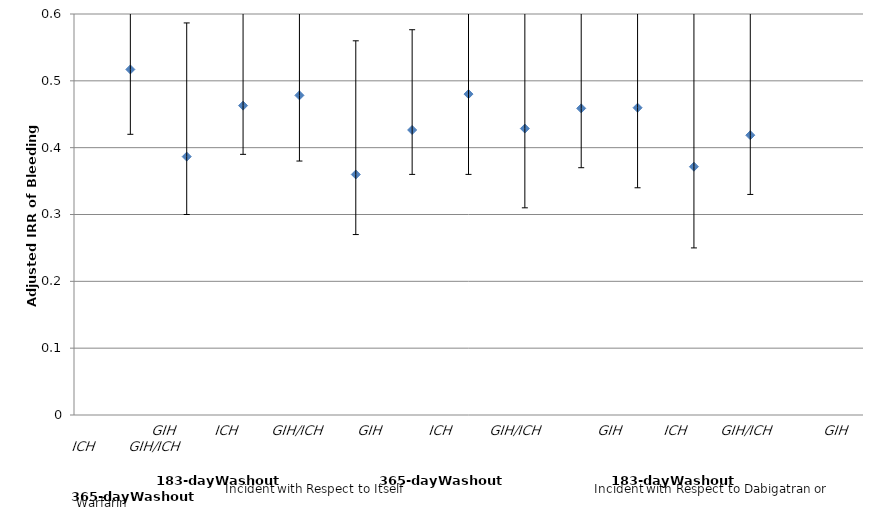
| Category | Series 0 |
|---|---|
| 0 | 0.517 |
| 1 | 0.387 |
| 2 | 0.463 |
| 3 | 0.478 |
| 4 | 0.36 |
| 5 | 0.426 |
| 6 | 0.48 |
| 7 | 0.429 |
| 8 | 0.459 |
| 9 | 0.46 |
| 10 | 0.372 |
| 11 | 0.419 |